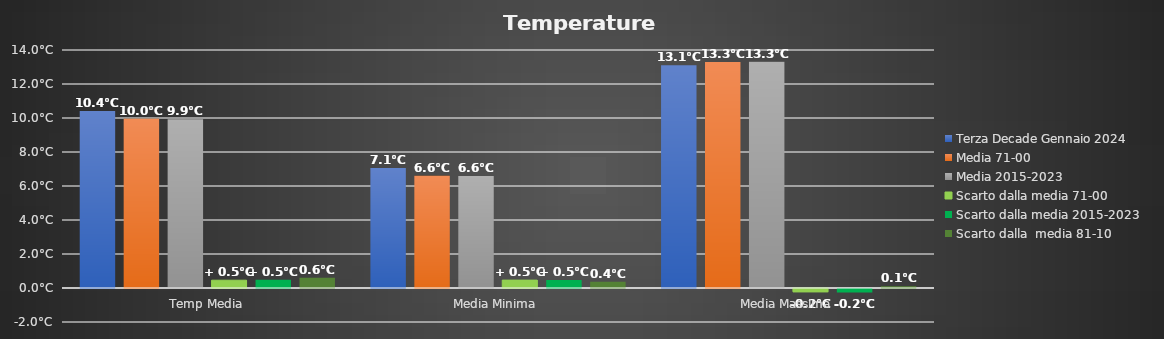
| Category | Terza Decade Gennaio 2024 | Media 71-00 | Media 2015-2023 | Scarto dalla media 71-00 | Scarto dalla media 2015-2023 | Scarto dalla  media 81-10 |
|---|---|---|---|---|---|---|
| Temp Media | 10.408 | 9.95 | 9.923 | 0.458 | 0.485 | 0.608 |
| Media Minima  | 7.064 | 6.6 | 6.595 | 0.464 | 0.469 | 0.364 |
| Media Massima | 13.109 | 13.3 | 13.311 | -0.191 | -0.202 | 0.109 |